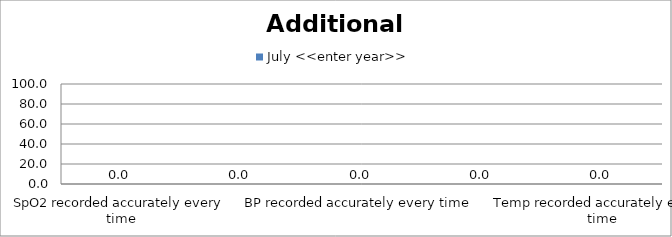
| Category | July <<enter year>> |
|---|---|
| SpO2 recorded accurately every time | 0 |
| CRT recorded accurately every time | 0 |
| BP recorded accurately every time | 0 |
| Skin Colour recorded accurately every time | 0 |
| Temp recorded accurately every time | 0 |